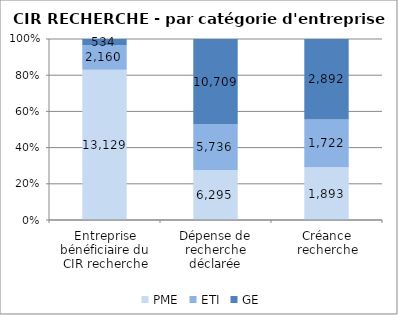
| Category | PME | ETI | GE |
|---|---|---|---|
| Entreprise bénéficiaire du CIR recherche | 13129 | 2160 | 534 |
| Dépense de recherche déclarée | 6295.46 | 5736.21 | 10709.33 |
| Créance recherche | 1892.87 | 1722.03 | 2891.97 |